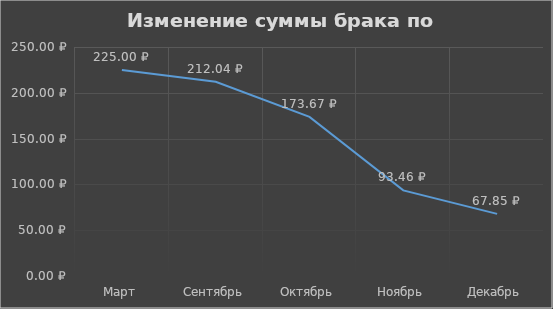
| Category | Сумма брака |
|---|---|
| Март | 225 |
| Сентябрь | 212.04 |
| Октябрь | 173.67 |
| Ноябрь | 93.46 |
| Декабрь | 67.85 |